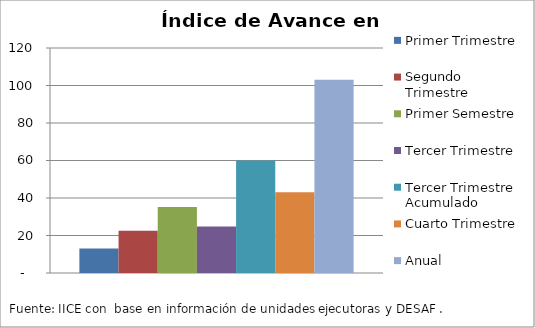
| Category | Primer Trimestre | Segundo Trimestre | Primer Semestre | Tercer Trimestre | Tercer Trimestre Acumulado | Cuarto Trimestre | Anual |
|---|---|---|---|---|---|---|---|
| 0 | 13.102 | 22.582 | 35.262 | 24.768 | 60.03 | 43.091 | 103.121 |